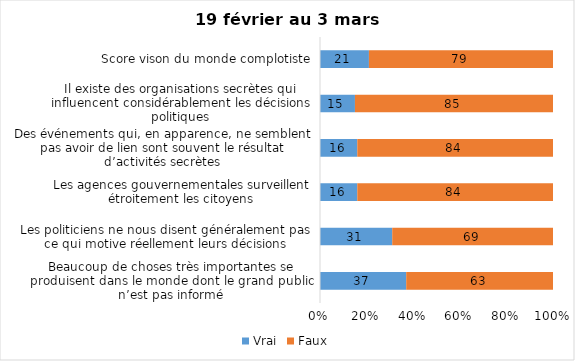
| Category | Vrai | Faux |
|---|---|---|
| Beaucoup de choses très importantes se produisent dans le monde dont le grand public n’est pas informé | 37 | 63 |
| Les politiciens ne nous disent généralement pas ce qui motive réellement leurs décisions | 31 | 69 |
| Les agences gouvernementales surveillent étroitement les citoyens | 16 | 84 |
| Des événements qui, en apparence, ne semblent pas avoir de lien sont souvent le résultat d’activités secrètes | 16 | 84 |
| Il existe des organisations secrètes qui influencent considérablement les décisions politiques | 15 | 85 |
| Score vison du monde complotiste | 21 | 79 |